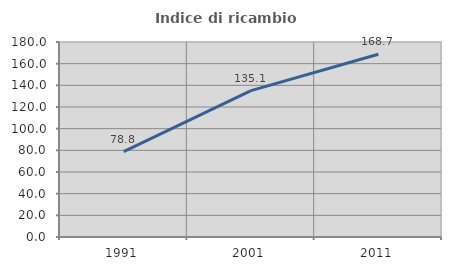
| Category | Indice di ricambio occupazionale  |
|---|---|
| 1991.0 | 78.788 |
| 2001.0 | 135.065 |
| 2011.0 | 168.675 |